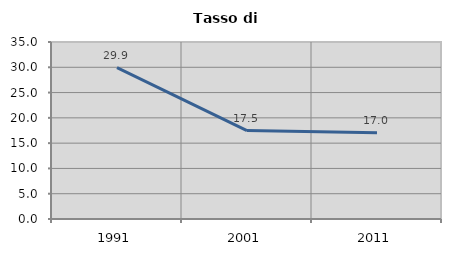
| Category | Tasso di disoccupazione   |
|---|---|
| 1991.0 | 29.948 |
| 2001.0 | 17.476 |
| 2011.0 | 17.041 |